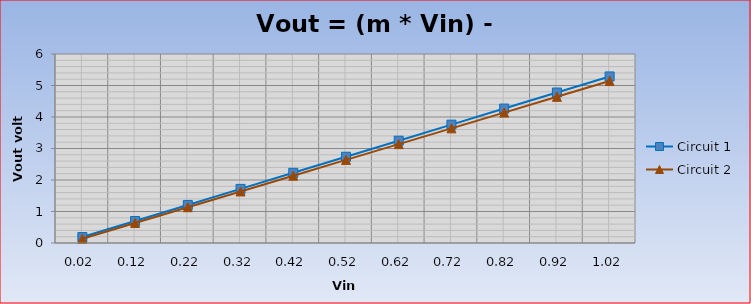
| Category | Circuit 1 | Circuit 2 |
|---|---|---|
| 0.02 | 0.188 | 0.135 |
| 0.12 | 0.698 | 0.635 |
| 0.22 | 1.208 | 1.136 |
| 0.32 | 1.718 | 1.637 |
| 0.42 | 2.228 | 2.137 |
| 0.52 | 2.738 | 2.638 |
| 0.62 | 3.248 | 3.139 |
| 0.72 | 3.758 | 3.639 |
| 0.82 | 4.267 | 4.14 |
| 0.92 | 4.777 | 4.64 |
| 1.02 | 5.287 | 5.141 |